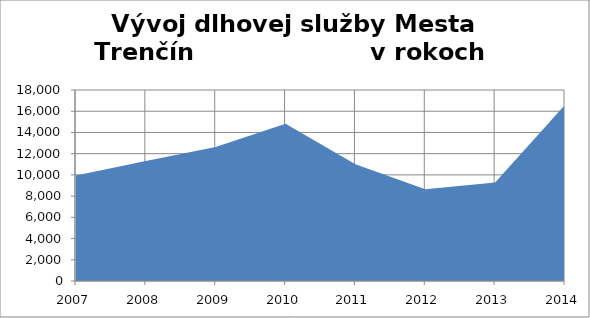
| Category | Series 0 |
|---|---|
| 2007.0 | 9941.114 |
| 2008.0 | 11302.197 |
| 2009.0 | 12629 |
| 2010.0 | 14817 |
| 2011.0 | 10995 |
| 2012.0 | 8649 |
| 2013.0 | 9293 |
| 2014.0 | 16598 |